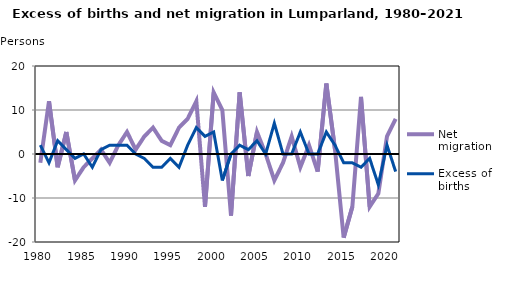
| Category | Net migration | Excess of births |
|---|---|---|
| 1980.0 | -2 | 2 |
| 1981.0 | 12 | -2 |
| 1982.0 | -3 | 3 |
| 1983.0 | 5 | 1 |
| 1984.0 | -6 | -1 |
| 1985.0 | -3 | 0 |
| 1986.0 | -1 | -3 |
| 1987.0 | 1 | 1 |
| 1988.0 | -2 | 2 |
| 1989.0 | 2 | 2 |
| 1990.0 | 5 | 2 |
| 1991.0 | 1 | 0 |
| 1992.0 | 4 | -1 |
| 1993.0 | 6 | -3 |
| 1994.0 | 3 | -3 |
| 1995.0 | 2 | -1 |
| 1996.0 | 6 | -3 |
| 1997.0 | 8 | 2 |
| 1998.0 | 12 | 6 |
| 1999.0 | -12 | 4 |
| 2000.0 | 14 | 5 |
| 2001.0 | 10 | -6 |
| 2002.0 | -14 | 0 |
| 2003.0 | 14 | 2 |
| 2004.0 | -5 | 1 |
| 2005.0 | 5 | 3 |
| 2006.0 | 0 | 0 |
| 2007.0 | -6 | 7 |
| 2008.0 | -2 | 0 |
| 2009.0 | 4 | 0 |
| 2010.0 | -3 | 5 |
| 2011.0 | 2 | 0 |
| 2012.0 | -4 | 0 |
| 2013.0 | 16 | 5 |
| 2014.0 | 1 | 2 |
| 2015.0 | -19 | -2 |
| 2016.0 | -12 | -2 |
| 2017.0 | 13 | -3 |
| 2018.0 | -12 | -1 |
| 2019.0 | -9 | -7 |
| 2020.0 | 4 | 2 |
| 2021.0 | 8 | -4 |